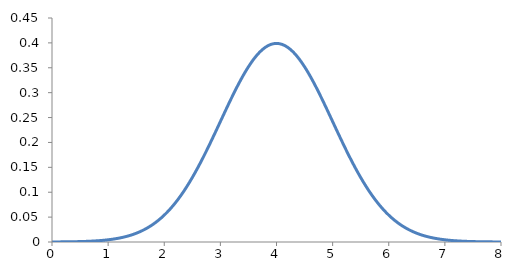
| Category | Series 0 |
|---|---|
| 0.0 | 0 |
| 0.1 | 0 |
| 0.2 | 0 |
| 0.3 | 0 |
| 0.4 | 0.001 |
| 0.5 | 0.001 |
| 0.6 | 0.001 |
| 0.7 | 0.002 |
| 0.8 | 0.002 |
| 0.9 | 0.003 |
| 1.0 | 0.004 |
| 1.1 | 0.006 |
| 1.2 | 0.008 |
| 1.3 | 0.01 |
| 1.4 | 0.014 |
| 1.5 | 0.018 |
| 1.6 | 0.022 |
| 1.7 | 0.028 |
| 1.8 | 0.035 |
| 1.9 | 0.044 |
| 2.0 | 0.054 |
| 2.1 | 0.066 |
| 2.2 | 0.079 |
| 2.3 | 0.094 |
| 2.4 | 0.111 |
| 2.5 | 0.13 |
| 2.6 | 0.15 |
| 2.7 | 0.171 |
| 2.8 | 0.194 |
| 2.9 | 0.218 |
| 3.0 | 0.242 |
| 3.1 | 0.266 |
| 3.2 | 0.29 |
| 3.3 | 0.312 |
| 3.4 | 0.333 |
| 3.5 | 0.352 |
| 3.6 | 0.368 |
| 3.7 | 0.381 |
| 3.8 | 0.391 |
| 3.9 | 0.397 |
| 4.0 | 0.399 |
| 4.1 | 0.397 |
| 4.2 | 0.391 |
| 4.3 | 0.381 |
| 4.4 | 0.368 |
| 4.5 | 0.352 |
| 4.6 | 0.333 |
| 4.7 | 0.312 |
| 4.8 | 0.29 |
| 4.9 | 0.266 |
| 5.0 | 0.242 |
| 5.1 | 0.218 |
| 5.2 | 0.194 |
| 5.3 | 0.171 |
| 5.4 | 0.15 |
| 5.5 | 0.13 |
| 5.6 | 0.111 |
| 5.7 | 0.094 |
| 5.8 | 0.079 |
| 5.9 | 0.066 |
| 6.0 | 0.054 |
| 6.1 | 0.044 |
| 6.2 | 0.035 |
| 6.3 | 0.028 |
| 6.4 | 0.022 |
| 6.5 | 0.018 |
| 6.6 | 0.014 |
| 6.7 | 0.01 |
| 6.8 | 0.008 |
| 6.9 | 0.006 |
| 7.0 | 0.004 |
| 7.1 | 0.003 |
| 7.2 | 0.002 |
| 7.3 | 0.002 |
| 7.4 | 0.001 |
| 7.5 | 0.001 |
| 7.6 | 0.001 |
| 7.7 | 0 |
| 7.8 | 0 |
| 7.9 | 0 |
| 8.0 | 0 |